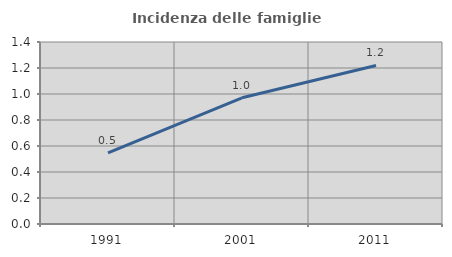
| Category | Incidenza delle famiglie numerose |
|---|---|
| 1991.0 | 0.547 |
| 2001.0 | 0.971 |
| 2011.0 | 1.22 |